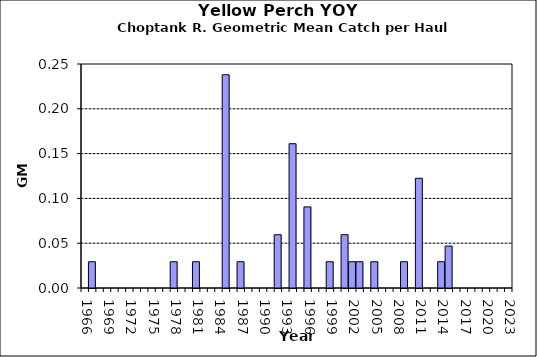
| Category | Series 0 |
|---|---|
| 1966.0 | 0 |
| 1967.0 | 0.029 |
| 1968.0 | 0 |
| 1969.0 | 0 |
| 1970.0 | 0 |
| 1971.0 | 0 |
| 1972.0 | 0 |
| 1973.0 | 0 |
| 1974.0 | 0 |
| 1975.0 | 0 |
| 1976.0 | 0 |
| 1977.0 | 0 |
| 1978.0 | 0.029 |
| 1979.0 | 0 |
| 1980.0 | 0 |
| 1981.0 | 0.029 |
| 1982.0 | 0 |
| 1983.0 | 0 |
| 1984.0 | 0 |
| 1985.0 | 0.238 |
| 1986.0 | 0 |
| 1987.0 | 0.029 |
| 1988.0 | 0 |
| 1989.0 | 0 |
| 1990.0 | 0 |
| 1991.0 | 0 |
| 1992.0 | 0.059 |
| 1993.0 | 0 |
| 1994.0 | 0.161 |
| 1995.0 | 0 |
| 1996.0 | 0.091 |
| 1997.0 | 0 |
| 1998.0 | 0 |
| 1999.0 | 0.029 |
| 2000.0 | 0 |
| 2001.0 | 0.059 |
| 2002.0 | 0.029 |
| 2003.0 | 0.029 |
| 2004.0 | 0 |
| 2005.0 | 0.029 |
| 2006.0 | 0 |
| 2007.0 | 0 |
| 2008.0 | 0 |
| 2009.0 | 0.029 |
| 2010.0 | 0 |
| 2011.0 | 0.122 |
| 2012.0 | 0 |
| 2013.0 | 0 |
| 2014.0 | 0.029 |
| 2015.0 | 0.047 |
| 2016.0 | 0 |
| 2017.0 | 0 |
| 2018.0 | 0 |
| 2019.0 | 0 |
| 2020.0 | 0 |
| 2021.0 | 0 |
| 2022.0 | 0 |
| 2023.0 | 0 |